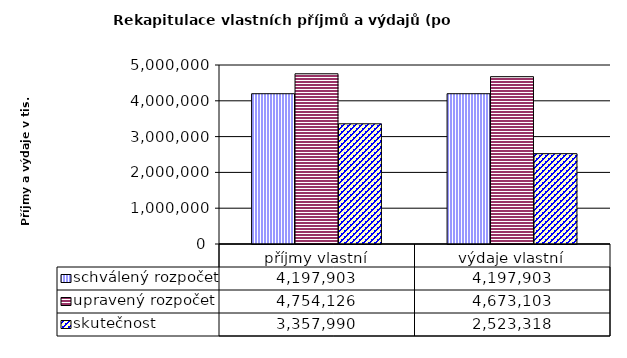
| Category | schválený rozpočet | upravený rozpočet | skutečnost |
|---|---|---|---|
| příjmy vlastní | 4197903 | 4754126 | 3357990 |
| výdaje vlastní | 4197903 | 4673103 | 2523318 |